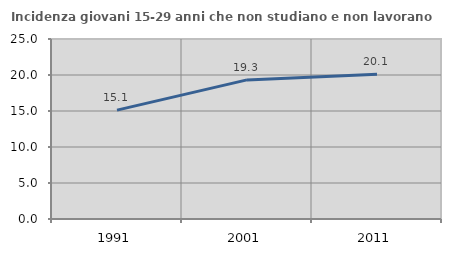
| Category | Incidenza giovani 15-29 anni che non studiano e non lavorano  |
|---|---|
| 1991.0 | 15.126 |
| 2001.0 | 19.318 |
| 2011.0 | 20.106 |